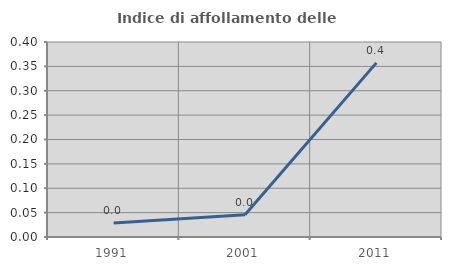
| Category | Indice di affollamento delle abitazioni  |
|---|---|
| 1991.0 | 0.029 |
| 2001.0 | 0.046 |
| 2011.0 | 0.357 |